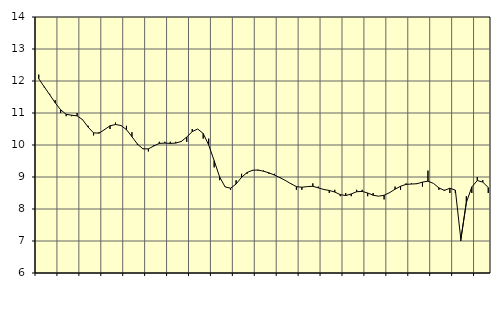
| Category | Piggar | Tillverkning av verkstadsvaror, SNI 25-30, 331 |
|---|---|---|
| nan | 12.2 | 12.07 |
| 1.0 | 11.8 | 11.82 |
| 1.0 | 11.6 | 11.57 |
| 1.0 | 11.4 | 11.32 |
| nan | 11 | 11.1 |
| 2.0 | 10.9 | 10.96 |
| 2.0 | 10.9 | 10.93 |
| 2.0 | 11 | 10.91 |
| nan | 10.8 | 10.79 |
| 3.0 | 10.6 | 10.56 |
| 3.0 | 10.3 | 10.38 |
| 3.0 | 10.4 | 10.37 |
| nan | 10.5 | 10.48 |
| 4.0 | 10.5 | 10.6 |
| 4.0 | 10.7 | 10.64 |
| 4.0 | 10.6 | 10.61 |
| nan | 10.6 | 10.48 |
| 5.0 | 10.4 | 10.26 |
| 5.0 | 10 | 10.03 |
| 5.0 | 9.9 | 9.88 |
| nan | 9.8 | 9.88 |
| 6.0 | 10 | 9.97 |
| 6.0 | 10.1 | 10.05 |
| 6.0 | 10.1 | 10.06 |
| nan | 10.1 | 10.05 |
| 7.0 | 10.1 | 10.06 |
| 7.0 | 10.1 | 10.11 |
| 7.0 | 10.1 | 10.25 |
| nan | 10.5 | 10.42 |
| 8.0 | 10.5 | 10.5 |
| 8.0 | 10.2 | 10.36 |
| 8.0 | 10.2 | 10 |
| nan | 9.3 | 9.51 |
| 9.0 | 8.9 | 9 |
| 9.0 | 8.7 | 8.69 |
| 9.0 | 8.6 | 8.65 |
| nan | 8.9 | 8.78 |
| 10.0 | 9.1 | 8.99 |
| 10.0 | 9.1 | 9.14 |
| 10.0 | 9.2 | 9.21 |
| nan | 9.2 | 9.22 |
| 11.0 | 9.2 | 9.18 |
| 11.0 | 9.1 | 9.13 |
| 11.0 | 9.1 | 9.06 |
| nan | 9 | 8.98 |
| 12.0 | 8.9 | 8.89 |
| 12.0 | 8.8 | 8.79 |
| 12.0 | 8.6 | 8.7 |
| nan | 8.6 | 8.68 |
| 13.0 | 8.7 | 8.7 |
| 13.0 | 8.8 | 8.71 |
| 13.0 | 8.7 | 8.66 |
| nan | 8.6 | 8.61 |
| 14.0 | 8.5 | 8.58 |
| 14.0 | 8.6 | 8.53 |
| 14.0 | 8.4 | 8.45 |
| nan | 8.5 | 8.42 |
| 15.0 | 8.4 | 8.47 |
| 15.0 | 8.6 | 8.54 |
| 15.0 | 8.6 | 8.55 |
| nan | 8.4 | 8.5 |
| 16.0 | 8.5 | 8.43 |
| 16.0 | 8.4 | 8.4 |
| 16.0 | 8.3 | 8.43 |
| nan | 8.5 | 8.51 |
| 17.0 | 8.7 | 8.62 |
| 17.0 | 8.6 | 8.71 |
| 17.0 | 8.8 | 8.77 |
| nan | 8.8 | 8.78 |
| 18.0 | 8.8 | 8.79 |
| 18.0 | 8.7 | 8.84 |
| 18.0 | 9.2 | 8.87 |
| nan | 8.8 | 8.8 |
| 19.0 | 8.6 | 8.66 |
| 19.0 | 8.6 | 8.58 |
| 19.0 | 8.5 | 8.65 |
| nan | 8.5 | 8.59 |
| 20.0 | 7 | 7.05 |
| 20.0 | 8.4 | 8.2 |
| 20.0 | 8.5 | 8.69 |
| nan | 9 | 8.89 |
| 21.0 | 8.9 | 8.84 |
| 21.0 | 8.5 | 8.67 |